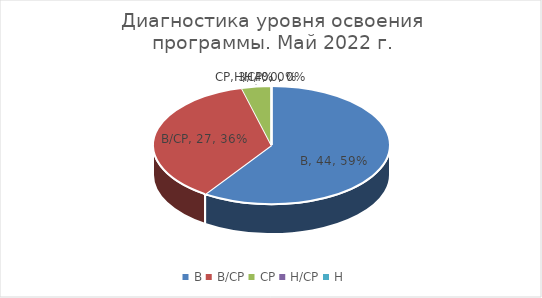
| Category | Series 0 |
|---|---|
| В | 44 |
| В/СР | 27 |
| СР | 3 |
| Н/СР | 0 |
| Н | 0 |